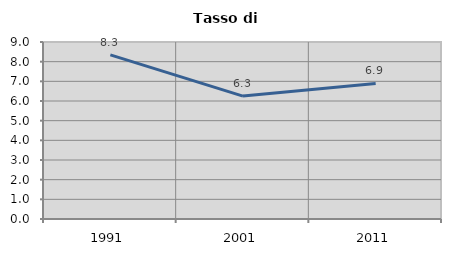
| Category | Tasso di disoccupazione   |
|---|---|
| 1991.0 | 8.345 |
| 2001.0 | 6.25 |
| 2011.0 | 6.894 |